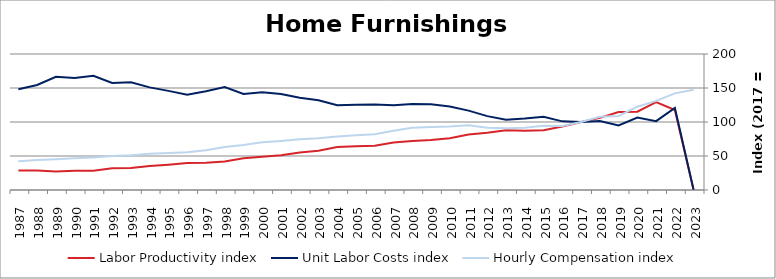
| Category | Labor Productivity index | Unit Labor Costs index | Hourly Compensation index |
|---|---|---|---|
| 2023.0 | 0 | 0 | 147.403 |
| 2022.0 | 117.631 | 120.778 | 142.073 |
| 2021.0 | 129.353 | 101.263 | 130.987 |
| 2020.0 | 115.104 | 106.444 | 122.521 |
| 2019.0 | 114.698 | 94.877 | 108.822 |
| 2018.0 | 106.042 | 101.47 | 107.601 |
| 2017.0 | 100 | 100 | 100 |
| 2016.0 | 93.255 | 100.927 | 94.119 |
| 2015.0 | 87.883 | 107.687 | 94.638 |
| 2014.0 | 87.283 | 104.974 | 91.624 |
| 2013.0 | 88.014 | 103.324 | 90.94 |
| 2012.0 | 84.178 | 108.617 | 91.432 |
| 2011.0 | 81.632 | 116.758 | 95.311 |
| 2010.0 | 76.157 | 122.815 | 93.533 |
| 2009.0 | 73.454 | 126.002 | 92.553 |
| 2008.0 | 72.213 | 126.548 | 91.384 |
| 2007.0 | 69.983 | 124.558 | 87.169 |
| 2006.0 | 65.106 | 125.772 | 81.884 |
| 2005.0 | 64.28 | 125.466 | 80.65 |
| 2004.0 | 63.095 | 124.698 | 78.678 |
| 2003.0 | 57.686 | 131.945 | 76.114 |
| 2002.0 | 55.032 | 135.538 | 74.589 |
| 2001.0 | 51.121 | 141.164 | 72.164 |
| 2000.0 | 48.833 | 143.686 | 70.166 |
| 1999.0 | 46.749 | 141.318 | 66.065 |
| 1998.0 | 41.81 | 151.353 | 63.28 |
| 1997.0 | 40.142 | 145.263 | 58.311 |
| 1996.0 | 39.628 | 140.125 | 55.529 |
| 1995.0 | 37.257 | 145.79 | 54.317 |
| 1994.0 | 35.316 | 150.917 | 53.299 |
| 1993.0 | 32.356 | 158.498 | 51.283 |
| 1992.0 | 31.822 | 157.389 | 50.085 |
| 1991.0 | 28.33 | 168.095 | 47.621 |
| 1990.0 | 28.335 | 164.598 | 46.64 |
| 1989.0 | 27.244 | 166.599 | 45.389 |
| 1988.0 | 28.555 | 154.438 | 44.099 |
| 1987.0 | 28.534 | 148.254 | 42.302 |